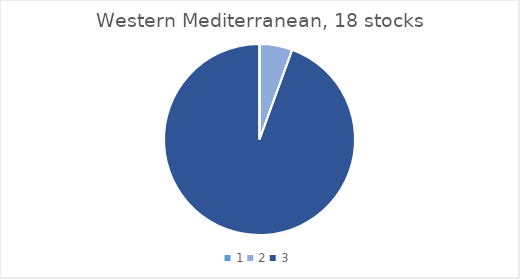
| Category | Western Med. |
|---|---|
| 0 | 0 |
| 1 | 1 |
| 2 | 17 |